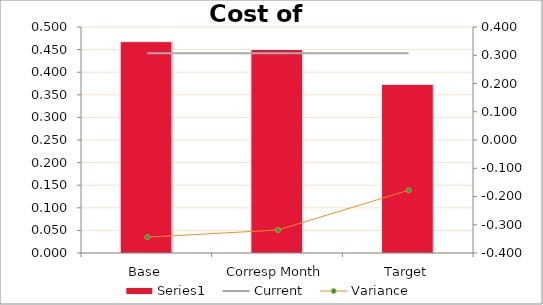
| Category | Series 0 |
|---|---|
| Base | 0.468 |
| Corresp Month | 0.45 |
| Target | 0.373 |